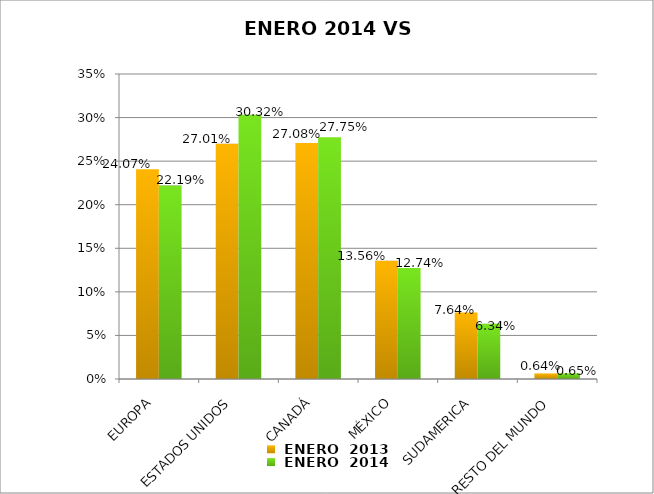
| Category |  ENERO  2013 |  ENERO  2014 |
|---|---|---|
| EUROPA | 0.241 | 0.222 |
| ESTADOS UNIDOS | 0.27 | 0.303 |
| CANADÁ | 0.271 | 0.278 |
| MÉXICO | 0.136 | 0.127 |
| SUDAMERICA | 0.076 | 0.063 |
| RESTO DEL MUNDO | 0.006 | 0.007 |